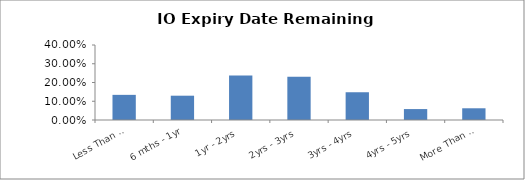
| Category | Series 0 |
|---|---|
| Less Than 6 mths | 0.134 |
| 6 mths - 1yr | 0.13 |
| 1yr - 2yrs | 0.237 |
| 2yrs - 3yrs | 0.23 |
| 3yrs - 4yrs | 0.148 |
| 4yrs - 5yrs | 0.058 |
| More Than 5 yrs | 0.062 |